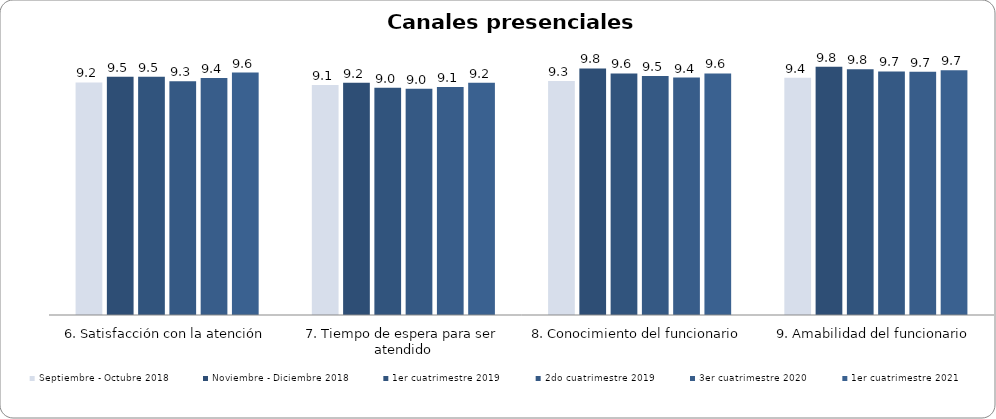
| Category | Septiembre - Octubre 2018 | Noviembre - Diciembre 2018 | 1er cuatrimestre 2019 | 2do cuatrimestre 2019 | 3er cuatrimestre 2020 | 1er cuatrimestre 2021 |
|---|---|---|---|---|---|---|
| 6. Satisfacción con la atención | 9.231 | 9.457 | 9.453 | 9.276 | 9.404 | 9.623 |
| 7. Tiempo de espera para ser atendido | 9.128 | 9.217 | 9.019 | 8.977 | 9.051 | 9.217 |
| 8. Conocimiento del funcionario | 9.282 | 9.783 | 9.585 | 9.483 | 9.424 | 9.585 |
| 9. Amabilidad del funcionario | 9.41 | 9.848 | 9.755 | 9.667 | 9.657 | 9.717 |